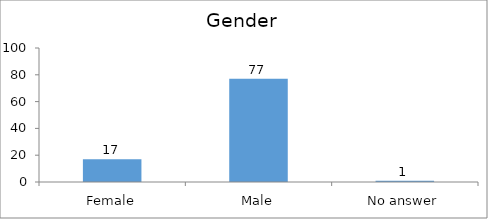
| Category | Gender |
|---|---|
| Female | 17 |
| Male | 77 |
| No answer | 1 |